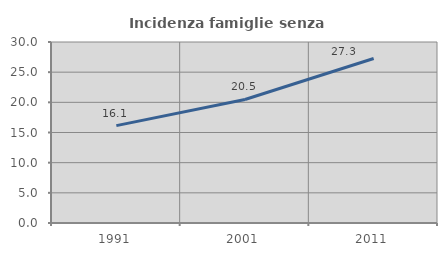
| Category | Incidenza famiglie senza nuclei |
|---|---|
| 1991.0 | 16.136 |
| 2001.0 | 20.471 |
| 2011.0 | 27.258 |